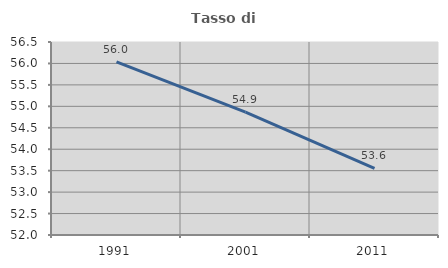
| Category | Tasso di occupazione   |
|---|---|
| 1991.0 | 56.038 |
| 2001.0 | 54.865 |
| 2011.0 | 53.554 |